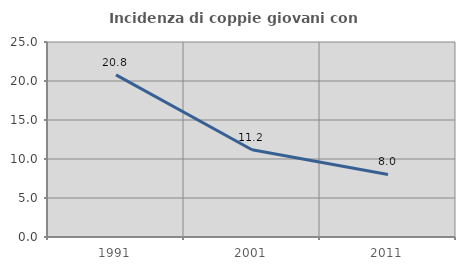
| Category | Incidenza di coppie giovani con figli |
|---|---|
| 1991.0 | 20.777 |
| 2001.0 | 11.188 |
| 2011.0 | 8.02 |